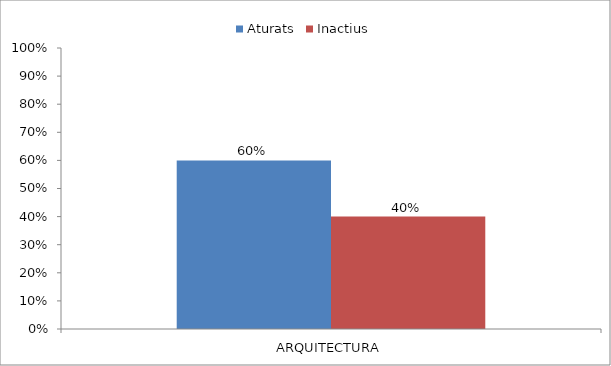
| Category | Aturats | Inactius |
|---|---|---|
| ARQUITECTURA | 0.6 | 0.4 |